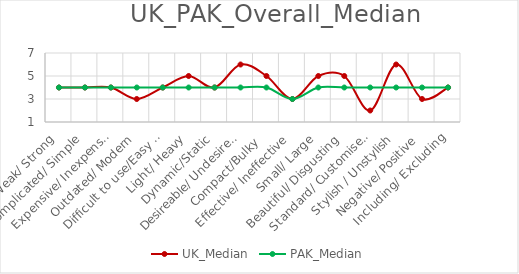
| Category | UK_Median | PAK_Median |
|---|---|---|
| Weak/ Strong | 4 | 4 |
| Complicated/ Simple | 4 | 4 |
| Expensive/ Inexpensive | 4 | 4 |
| Outdated/ Modern | 3 | 4 |
| Difficult to use/Easy to use | 4 | 4 |
| Light/ Heavy | 5 | 4 |
| Dynamic/Static | 4 | 4 |
| Desireable/ Undesireable | 6 | 4 |
| Compact/Bulky  | 5 | 4 |
| Effective/ Ineffective | 3 | 3 |
| Small/ Large | 5 | 4 |
| Beautiful/ Disgusting | 5 | 4 |
| Standard/ Customised   | 2 | 4 |
| Stylish / Unstylish | 6 | 4 |
| Negative/ Positive | 3 | 4 |
| Including/ Excluding | 4 | 4 |